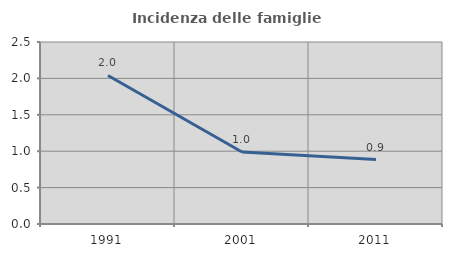
| Category | Incidenza delle famiglie numerose |
|---|---|
| 1991.0 | 2.041 |
| 2001.0 | 0.988 |
| 2011.0 | 0.885 |